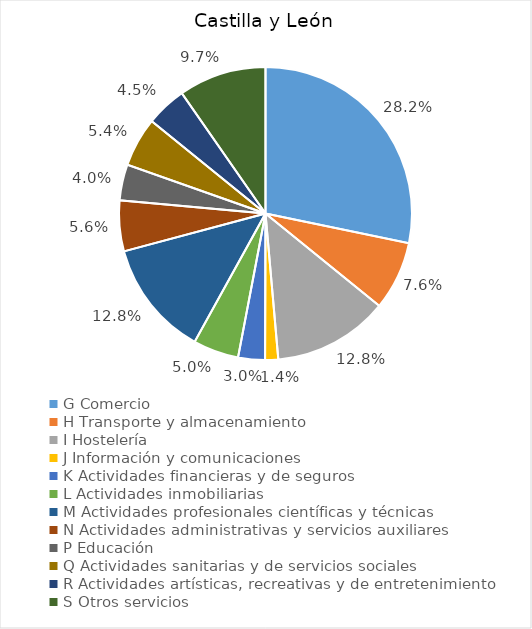
| Category | Series 0 |
|---|---|
| G Comercio | 35018 |
| H Transporte y almacenamiento | 9435 |
| I Hostelería | 15808 |
| J Información y comunicaciones | 1788 |
| K Actividades financieras y de seguros | 3664 |
| L Actividades inmobiliarias | 6232 |
| M Actividades profesionales científicas y técnicas | 15884 |
| N Actividades administrativas y servicios auxiliares | 6931 |
| P Educación | 4930 |
| Q Actividades sanitarias y de servicios sociales | 6744 |
| R Actividades artísticas, recreativas y de entretenimiento | 5550 |
| S Otros servicios | 11998 |